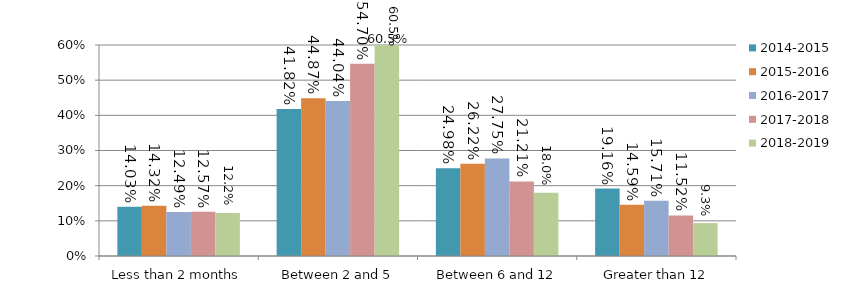
| Category | 2014-2015 | 2015-2016 | 2016-2017 | 2017-2018 | 2018-2019 |
|---|---|---|---|---|---|
| Less than 2 months | 0.14 | 0.143 | 0.125 | 0.126 | 0.122 |
| Between 2 and 5 months | 0.418 | 0.449 | 0.44 | 0.547 | 0.605 |
| Between 6 and 12 months | 0.25 | 0.262 | 0.278 | 0.212 | 0.18 |
| Greater than 12 months | 0.192 | 0.146 | 0.157 | 0.115 | 0.093 |